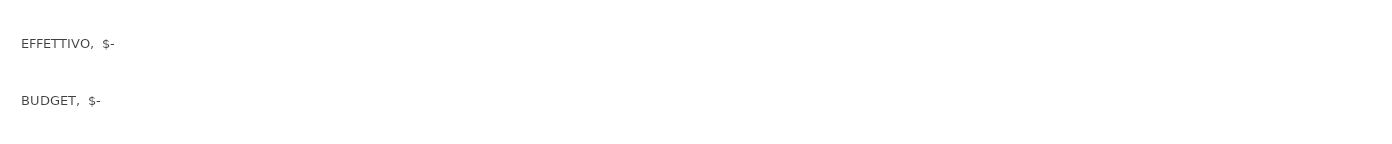
| Category | Series 0 |
|---|---|
| BUDGET | 0 |
| EFFETTIVO | 0 |